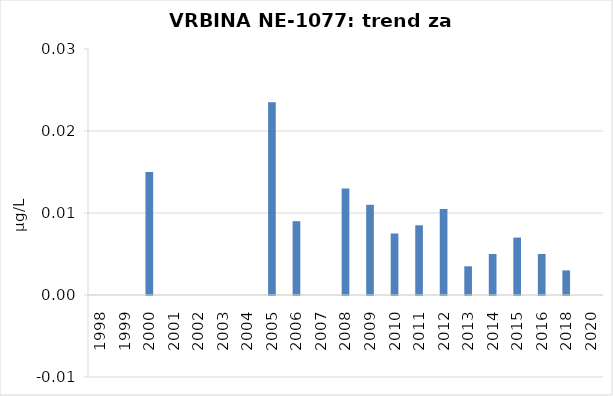
| Category | Vsota |
|---|---|
| 1998 | 0 |
| 1999 | 0 |
| 2000 | 0.015 |
| 2001 | 0 |
| 2002 | 0 |
| 2003 | 0 |
| 2004 | 0 |
| 2005 | 0.024 |
| 2006 | 0.009 |
| 2007 | 0 |
| 2008 | 0.013 |
| 2009 | 0.011 |
| 2010 | 0.008 |
| 2011 | 0.008 |
| 2012 | 0.01 |
| 2013 | 0.004 |
| 2014 | 0.005 |
| 2015 | 0.007 |
| 2016 | 0.005 |
| 2018 | 0.003 |
| 2020 | 0 |